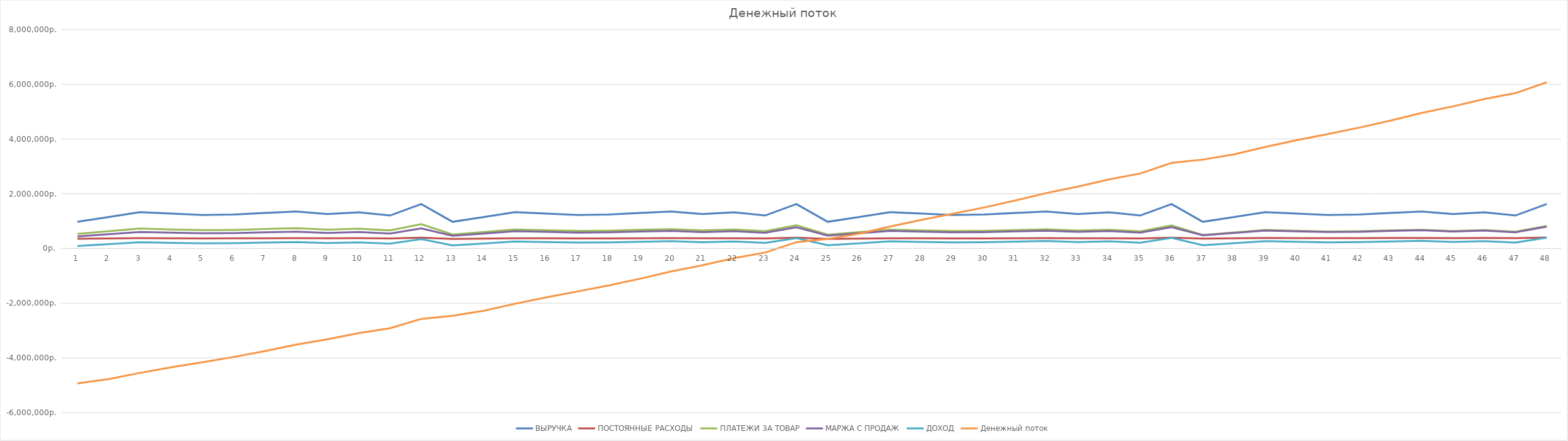
| Category | ВЫРУЧКА | ПОСТОЯННЫЕ РАСХОДЫ | ПЛАТЕЖИ ЗА ТОВАР | МАРЖА С ПРОДАЖ | ДОХОД | Денежный поток |
|---|---|---|---|---|---|---|
| 0 | 975240 | 352875.562 | 533426.727 | 441813.273 | 88937.711 | -4930462.289 |
| 1 | 1150640 | 364348.316 | 629365.212 | 521274.788 | 156926.472 | -4773535.818 |
| 2 | 1330030 | 376082.053 | 727486.106 | 602543.894 | 226461.841 | -4547073.977 |
| 3 | 1274280 | 372435.496 | 696992.545 | 577287.455 | 204851.958 | -4342222.019 |
| 4 | 1224615 | 369186.954 | 669827.295 | 554787.705 | 185600.751 | -4156621.268 |
| 5 | 1240500 | 370225.977 | 678515.909 | 561984.091 | 191758.114 | -3964863.154 |
| 6 | 1300959 | 374180.546 | 711585.15 | 589373.85 | 215193.304 | -3749669.85 |
| 7 | 1350900 | 377447.141 | 738901.364 | 611998.636 | 234551.495 | -3515118.354 |
| 8 | 1258113 | 371378.028 | 688149.686 | 569963.314 | 198585.286 | -3316533.068 |
| 9 | 1324300 | 375707.259 | 724351.97 | 599948.03 | 224240.771 | -3092292.297 |
| 10 | 1206200 | 367982.445 | 659754.848 | 546445.152 | 178462.706 | -2913829.591 |
| 11 | 1625029 | 395377.67 | 888841.62 | 736187.38 | 340809.711 | -2573019.88 |
| 12 | 975240 | 352210.625 | 511262.182 | 463977.818 | 111767.193 | -2461252.688 |
| 13 | 1150640 | 363563.789 | 603214.303 | 547425.697 | 183861.908 | -2277390.78 |
| 14 | 1330030 | 375175.215 | 697258.152 | 632771.848 | 257596.634 | -2019794.146 |
| 15 | 1274280 | 371566.669 | 668031.636 | 606248.364 | 234681.695 | -1785112.451 |
| 16 | 1224615 | 368351.989 | 641995.136 | 582619.864 | 214267.875 | -1570844.577 |
| 17 | 1240500 | 369380.182 | 650322.727 | 590177.273 | 220797.091 | -1350047.486 |
| 18 | 1300959 | 373293.528 | 682017.9 | 618941.1 | 245647.572 | -1104399.914 |
| 19 | 1350900 | 376526.073 | 708199.091 | 642700.909 | 266174.836 | -838225.077 |
| 20 | 1258113 | 370520.223 | 659556.209 | 598556.791 | 228036.568 | -610188.51 |
| 21 | 1324300 | 374804.327 | 694254.242 | 630045.758 | 255241.43 | -354947.079 |
| 22 | 1206200 | 367160.036 | 632341.212 | 573858.788 | 206698.752 | -148248.328 |
| 23 | 1625029 | 394269.695 | 851909.142 | 773119.858 | 378850.162 | 230601.834 |
| 24 | 975240 | 352033.309 | 505351.636 | 469888.364 | 117855.055 | 348456.889 |
| 25 | 1150640 | 363354.582 | 596240.727 | 554399.273 | 191044.691 | 539501.58 |
| 26 | 1330030 | 374933.391 | 689197.364 | 640832.636 | 265899.245 | 805400.825 |
| 27 | 1274280 | 371334.982 | 660308.727 | 613971.273 | 242636.291 | 1048037.116 |
| 28 | 1224615 | 368129.332 | 634573.227 | 590041.773 | 221912.441 | 1269949.557 |
| 29 | 1240500 | 369154.636 | 642804.545 | 597695.455 | 228540.818 | 1498490.375 |
| 30 | 1300959 | 373056.99 | 674133.3 | 626825.7 | 253768.71 | 1752259.085 |
| 31 | 1350900 | 376280.455 | 700011.818 | 650888.182 | 274607.727 | 2026866.813 |
| 32 | 1258113 | 370291.475 | 651931.282 | 606181.718 | 235890.243 | 2262757.055 |
| 33 | 1324300 | 374563.545 | 686228.182 | 638071.818 | 263508.273 | 2526265.328 |
| 34 | 1206200 | 366940.727 | 625030.909 | 581169.091 | 214228.364 | 2740493.692 |
| 35 | 1625029 | 393974.235 | 842060.482 | 782968.518 | 388994.283 | 3129487.974 |
| 36 | 975240 | 361723.005 | 495008.182 | 480231.818 | 118508.813 | 3247996.787 |
| 37 | 1150640 | 372988.469 | 584036.97 | 566603.03 | 193614.561 | 3441611.348 |
| 38 | 1330030 | 384510.2 | 675090.985 | 654939.015 | 270428.816 | 3712040.164 |
| 39 | 1274280 | 380929.529 | 646793.636 | 627486.364 | 246556.835 | 3958596.998 |
| 40 | 1224615 | 377739.682 | 621584.886 | 603030.114 | 225290.432 | 4183887.43 |
| 41 | 1240500 | 378759.932 | 629647.727 | 610852.273 | 232092.341 | 4415979.771 |
| 42 | 1300959 | 382643.048 | 660335.25 | 640623.75 | 257980.702 | 4673960.473 |
| 43 | 1350900 | 385850.623 | 685684.091 | 665215.909 | 279365.286 | 4953325.759 |
| 44 | 1258113 | 379891.167 | 638587.659 | 619525.341 | 239634.174 | 5192959.933 |
| 45 | 1324300 | 384142.177 | 672182.576 | 652117.424 | 267975.247 | 5460935.18 |
| 46 | 1206200 | 376556.936 | 612237.879 | 593962.121 | 217405.185 | 5678340.365 |
| 47 | 1625029 | 403457.181 | 824825.326 | 800203.674 | 396746.493 | 6075086.859 |